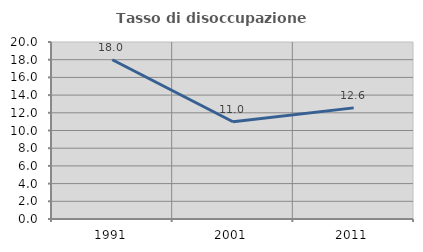
| Category | Tasso di disoccupazione giovanile  |
|---|---|
| 1991.0 | 17.995 |
| 2001.0 | 10.993 |
| 2011.0 | 12.556 |